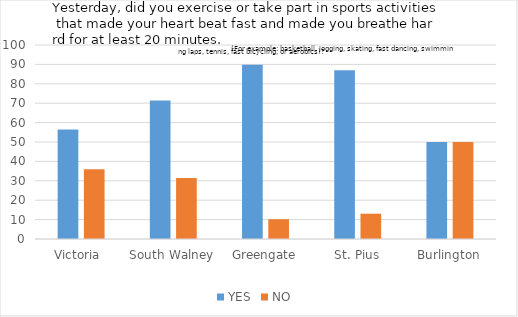
| Category | YES | NO  |
|---|---|---|
| Victoria  | 56.41 | 35.897 |
| South Walney | 71.429 | 31.429 |
| Greengate | 89.796 | 10.204 |
| St. Pius | 86.957 | 13.043 |
| Burlington | 50 | 50 |